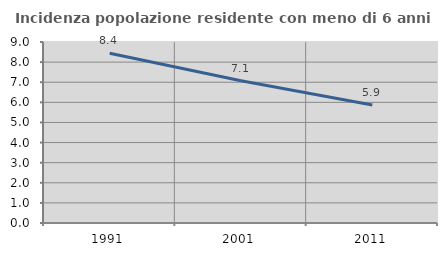
| Category | Incidenza popolazione residente con meno di 6 anni |
|---|---|
| 1991.0 | 8.437 |
| 2001.0 | 7.07 |
| 2011.0 | 5.865 |